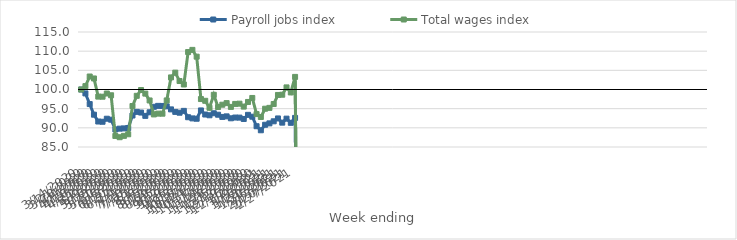
| Category | Payroll jobs index | Total wages index |
|---|---|---|
| 14/03/2020 | 100 | 100 |
| 21/03/2020 | 98.98 | 100.882 |
| 28/03/2020 | 96.2 | 103.389 |
| 04/04/2020 | 93.427 | 102.88 |
| 11/04/2020 | 91.647 | 98.143 |
| 18/04/2020 | 91.587 | 98.12 |
| 25/04/2020 | 92.376 | 98.953 |
| 02/05/2020 | 92.129 | 98.492 |
| 09/05/2020 | 89.577 | 87.883 |
| 16/05/2020 | 89.785 | 87.553 |
| 23/05/2020 | 89.853 | 87.904 |
| 30/05/2020 | 89.958 | 88.321 |
| 06/06/2020 | 93.214 | 95.69 |
| 13/06/2020 | 94.166 | 98.352 |
| 20/06/2020 | 93.986 | 99.858 |
| 27/06/2020 | 93.121 | 98.928 |
| 04/07/2020 | 94.057 | 97.14 |
| 11/07/2020 | 95.488 | 93.495 |
| 18/07/2020 | 95.73 | 93.709 |
| 25/07/2020 | 95.711 | 93.691 |
| 01/08/2020 | 95.614 | 97.15 |
| 08/08/2020 | 94.814 | 103.151 |
| 15/08/2020 | 94.16 | 104.399 |
| 22/08/2020 | 93.947 | 102.211 |
| 29/08/2020 | 94.427 | 101.312 |
| 05/09/2020 | 92.766 | 109.767 |
| 12/09/2020 | 92.461 | 110.337 |
| 19/09/2020 | 92.372 | 108.566 |
| 26/09/2020 | 94.54 | 97.507 |
| 03/10/2020 | 93.474 | 97.052 |
| 10/10/2020 | 93.278 | 95.233 |
| 17/10/2020 | 93.8 | 98.618 |
| 24/10/2020 | 93.42 | 95.428 |
| 31/10/2020 | 92.843 | 96.031 |
| 07/11/2020 | 92.993 | 96.45 |
| 14/11/2020 | 92.491 | 95.461 |
| 21/11/2020 | 92.687 | 96.237 |
| 28/11/2020 | 92.666 | 96.3 |
| 05/12/2020 | 92.312 | 95.538 |
| 12/12/2020 | 93.39 | 96.75 |
| 19/12/2020 | 92.906 | 97.791 |
| 26/12/2020 | 90.417 | 93.588 |
| 02/01/2021 | 89.363 | 92.831 |
| 09/01/2021 | 90.802 | 94.989 |
| 16/01/2021 | 91.166 | 95.209 |
| 23/01/2021 | 91.702 | 96.211 |
| 30/01/2021 | 92.451 | 98.581 |
| 06/02/2021 | 91.354 | 98.638 |
| 13/02/2021 | 92.395 | 100.547 |
| 20/02/2021 | 91.307 | 99.231 |
| 27/02/2021 | 92.594 | 103.288 |